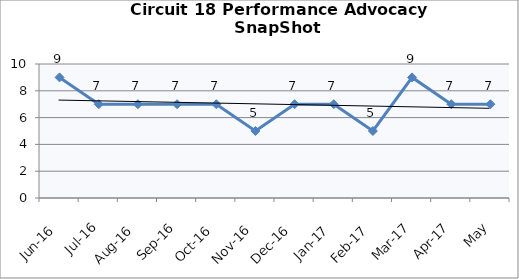
| Category | Circuit 18 |
|---|---|
| Jun-16 | 9 |
| Jul-16 | 7 |
| Aug-16 | 7 |
| Sep-16 | 7 |
| Oct-16 | 7 |
| Nov-16 | 5 |
| Dec-16 | 7 |
| Jan-17 | 7 |
| Feb-17 | 5 |
| Mar-17 | 9 |
| Apr-17 | 7 |
| May | 7 |